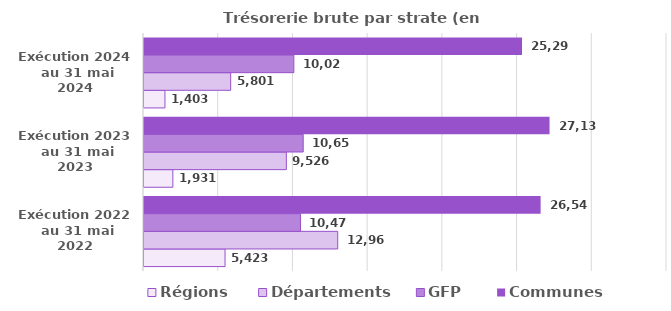
| Category | Régions | Départements | GFP | Communes  |
|---|---|---|---|---|
| Exécution 2022
 au 31 mai 2022 | 5422.8 | 12963.4 | 10471.5 | 26542.4 |
| Exécution 2023
 au 31 mai 2023 | 1931.2 | 9526.4 | 10654.3 | 27139.2 |
| Exécution 2024
 au 31 mai 2024 | 1402.6 | 5800.6 | 10026.9 | 25298.2 |